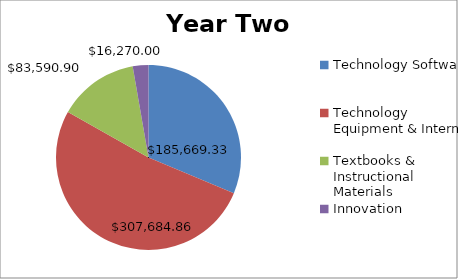
| Category | Year Two Amount |
|---|---|
| Technology Software | 185669.33 |
| Technology Equipment & Internet | 307684.86 |
| Textbooks & Instructional Materials | 83590.9 |
| Innovation | 16270 |